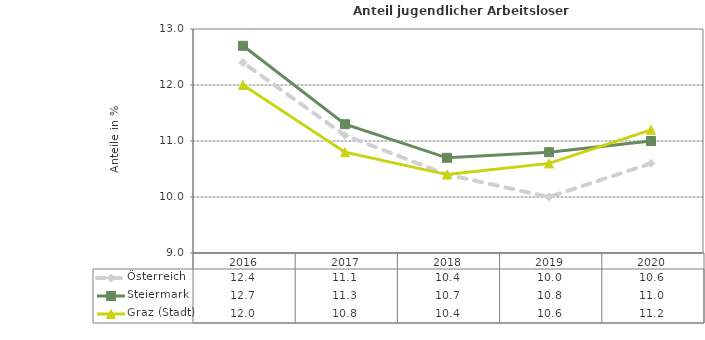
| Category | Österreich | Steiermark | Graz (Stadt) |
|---|---|---|---|
| 2020.0 | 10.6 | 11 | 11.2 |
| 2019.0 | 10 | 10.8 | 10.6 |
| 2018.0 | 10.4 | 10.7 | 10.4 |
| 2017.0 | 11.1 | 11.3 | 10.8 |
| 2016.0 | 12.4 | 12.7 | 12 |